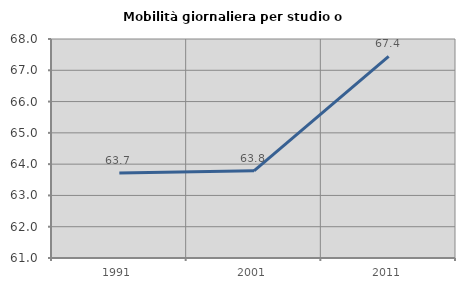
| Category | Mobilità giornaliera per studio o lavoro |
|---|---|
| 1991.0 | 63.721 |
| 2001.0 | 63.786 |
| 2011.0 | 67.443 |